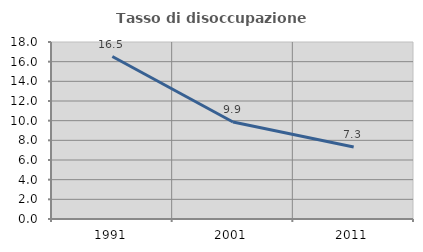
| Category | Tasso di disoccupazione giovanile  |
|---|---|
| 1991.0 | 16.522 |
| 2001.0 | 9.859 |
| 2011.0 | 7.317 |